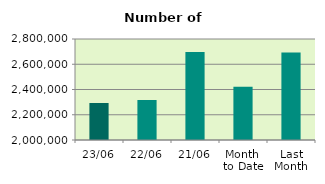
| Category | Series 0 |
|---|---|
| 23/06 | 2293010 |
| 22/06 | 2316746 |
| 21/06 | 2697070 |
| Month 
to Date | 2422323.412 |
| Last
Month | 2692139.333 |